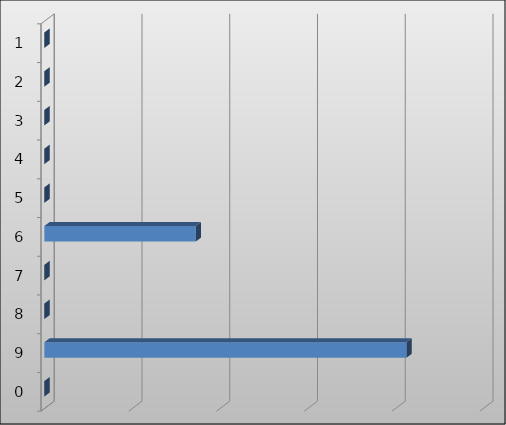
| Category | Series 0 |
|---|---|
| 1.0 | 0 |
| 2.0 | 0 |
| 3.0 | 0 |
| 4.0 | 0 |
| 5.0 | 0 |
| 6.0 | 862500 |
| 7.0 | 0 |
| 8.0 | 0 |
| 9.0 | 2063100 |
| 0.0 | 0 |